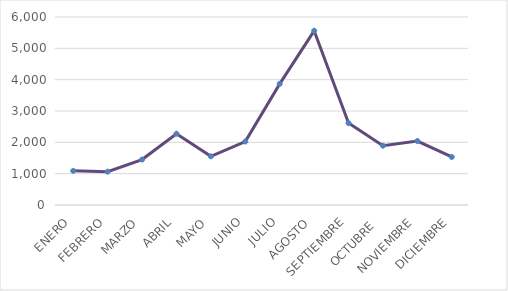
| Category | Series 0 |
|---|---|
| ENERO | 1090 |
| FEBRERO | 1064 |
| MARZO | 1450 |
| ABRIL | 2275 |
| MAYO | 1553 |
| JUNIO | 2026 |
| JULIO | 3866 |
| AGOSTO | 5559 |
| SEPTIEMBRE | 2613 |
| OCTUBRE  | 1892 |
| NOVIEMBRE | 2041 |
| DICIEMBRE | 1533 |